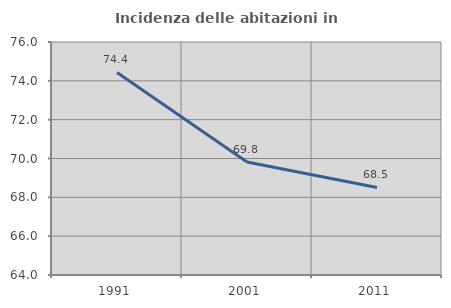
| Category | Incidenza delle abitazioni in proprietà  |
|---|---|
| 1991.0 | 74.429 |
| 2001.0 | 69.818 |
| 2011.0 | 68.506 |